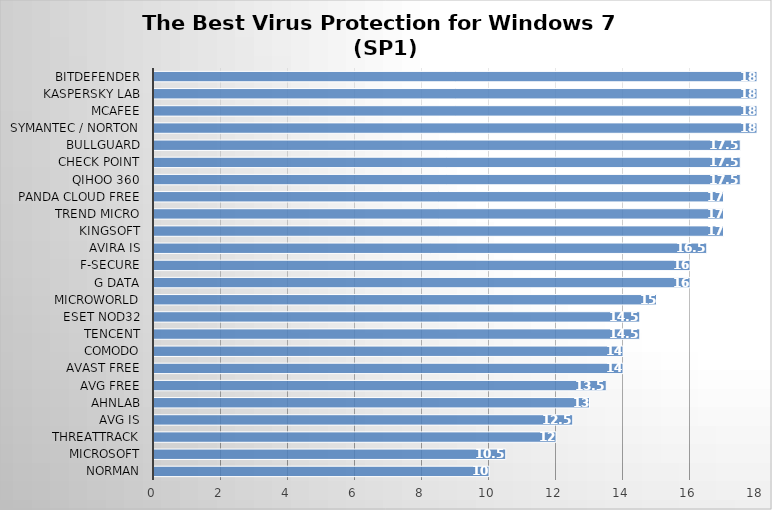
| Category | Series 0 |
|---|---|
| Norman | 10 |
| Microsoft | 10.5 |
| ThreatTrack | 12 |
| AVG IS | 12.5 |
| AhnLab | 13 |
| AVG Free | 13.5 |
| Avast Free | 14 |
| Comodo | 14 |
| Tencent | 14.5 |
| ESET Nod32 | 14.5 |
| Microworld | 15 |
| G Data | 16 |
| F-Secure | 16 |
| Avira IS | 16.5 |
| Kingsoft | 17 |
| Trend Micro | 17 |
| Panda Cloud Free | 17 |
| Qihoo 360 | 17.5 |
| Check Point | 17.5 |
| BullGuard | 17.5 |
| Symantec / Norton | 18 |
| McAfee | 18 |
| Kaspersky Lab | 18 |
| Bitdefender | 18 |